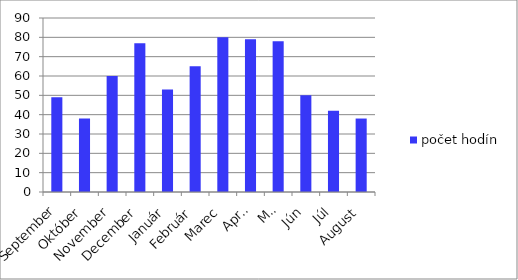
| Category | počet hodín |
|---|---|
| September | 49 |
| Október | 38 |
| November | 60 |
| December | 77 |
| Január | 53 |
| Február | 65 |
| Marec | 80 |
| Apríl | 79 |
| Máj | 78 |
| Jún | 50 |
| Júl | 42 |
| August | 38 |